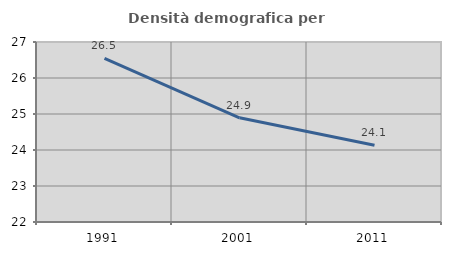
| Category | Densità demografica |
|---|---|
| 1991.0 | 26.546 |
| 2001.0 | 24.895 |
| 2011.0 | 24.133 |